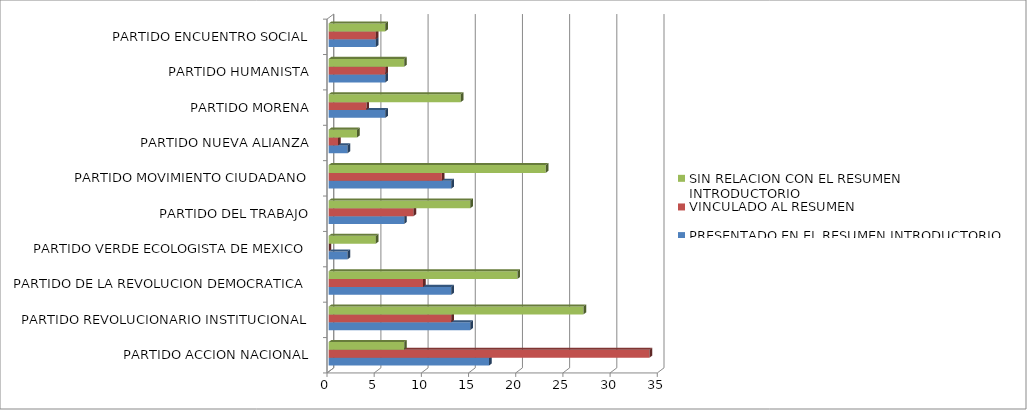
| Category | PRESENTADO EN EL RESUMEN INTRODUCTORIO | VINCULADO AL RESUMEN | SIN RELACION CON EL RESUMEN INTRODUCTORIO |
|---|---|---|---|
| PARTIDO ACCION NACIONAL | 17 | 34 | 8 |
| PARTIDO REVOLUCIONARIO INSTITUCIONAL | 15 | 13 | 27 |
| PARTIDO DE LA REVOLUCION DEMOCRATICA | 13 | 10 | 20 |
| PARTIDO VERDE ECOLOGISTA DE MEXICO | 2 | 0 | 5 |
| PARTIDO DEL TRABAJO | 8 | 9 | 15 |
| PARTIDO MOVIMIENTO CIUDADANO | 13 | 12 | 23 |
| PARTIDO NUEVA ALIANZA | 2 | 1 | 3 |
| PARTIDO MORENA | 6 | 4 | 14 |
| PARTIDO HUMANISTA | 6 | 6 | 8 |
| PARTIDO ENCUENTRO SOCIAL | 5 | 5 | 6 |